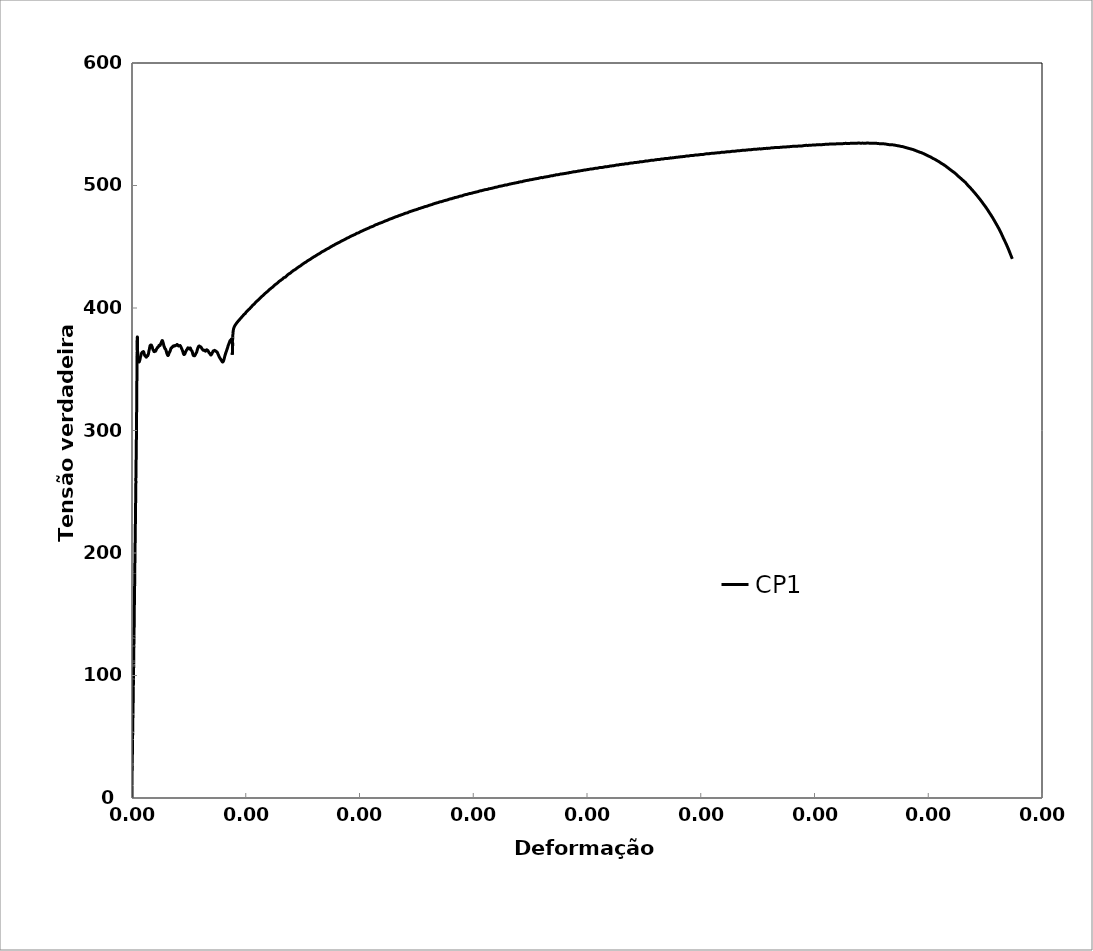
| Category | CP1 |
|---|---|
| 0.0 | 0 |
| 0.0 | 6.347 |
| 0.0 | 6.924 |
| 0.0 | 7.405 |
| 0.0 | 7.789 |
| -1.6833141676528276e-05 | 8.27 |
| -1.6833141676528276e-05 | 8.655 |
| -1.6833141676528276e-05 | 9.136 |
| -1.6833141676528276e-05 | 9.52 |
| -2.5249318761371077e-05 | 10.001 |
| -1.6833141676528276e-05 | 10.482 |
| -8.416035414737781e-06 | 10.963 |
| -8.416035414737781e-06 | 11.444 |
| -8.416035414737781e-06 | 11.924 |
| 0.0 | 12.405 |
| 0.0 | 12.886 |
| 0.0 | 13.463 |
| 0.0 | 14.04 |
| 0.0 | 14.521 |
| 8.416364582348424e-06 | 15.098 |
| 8.416364582348424e-06 | 15.675 |
| 8.416364582348424e-06 | 16.252 |
| 8.416364582348424e-06 | 16.829 |
| 8.416364582348424e-06 | 17.406 |
| 1.6832858326528217e-05 | 17.887 |
| 1.6832858326528217e-05 | 18.464 |
| 1.6832858326528217e-05 | 19.041 |
| 1.6832858326528217e-05 | 19.618 |
| 1.6832858326528217e-05 | 20.291 |
| 1.6832858326528217e-05 | 20.772 |
| 1.6832858326528217e-05 | 21.349 |
| 1.6832858326528217e-05 | 21.926 |
| 2.5248681249258854e-05 | 22.503 |
| 2.5248681249258854e-05 | 23.081 |
| 2.5248681249258854e-05 | 23.561 |
| 2.5248681249258854e-05 | 24.138 |
| 3.366543331292845e-05 | 24.812 |
| 3.366543331292845e-05 | 25.389 |
| 2.5248681249258854e-05 | 25.966 |
| 3.366543331292845e-05 | 26.447 |
| 4.208111457747699e-05 | 27.024 |
| 3.366543331292845e-05 | 27.601 |
| 4.208111457747699e-05 | 28.178 |
| 4.208111457747699e-05 | 28.755 |
| 4.208111457747699e-05 | 29.236 |
| 4.208111457747699e-05 | 29.717 |
| 4.208111457747699e-05 | 30.294 |
| 5.04967250189304e-05 | 30.87 |
| 5.04967250189304e-05 | 31.45 |
| 5.04967250189304e-05 | 31.929 |
| 5.04967250189304e-05 | 32.409 |
| 5.04967250189304e-05 | 32.988 |
| 5.04967250189304e-05 | 33.564 |
| 5.8913264579652434e-05 | 34.141 |
| 5.8913264579652434e-05 | 34.623 |
| 5.8913264579652434e-05 | 35.103 |
| 6.732873337007673e-05 | 35.583 |
| 6.732873337007673e-05 | 36.162 |
| 6.732873337007673e-05 | 36.642 |
| 6.732873337007673e-05 | 37.122 |
| 6.732873337007673e-05 | 37.604 |
| 6.732873337007673e-05 | 38.084 |
| 6.732873337007673e-05 | 38.567 |
| 7.574513126510098e-05 | 39.047 |
| 7.574513126510098e-05 | 39.526 |
| 7.574513126510098e-05 | 39.913 |
| 7.574513126510098e-05 | 40.392 |
| 7.574513126510098e-05 | 40.875 |
| 7.574513126510098e-05 | 41.355 |
| 8.416045840926459e-05 | 41.741 |
| 8.416045840926459e-05 | 42.124 |
| 8.416045840926459e-05 | 42.607 |
| 8.416045840926459e-05 | 42.99 |
| 8.416045840926459e-05 | 43.376 |
| 8.416045840926459e-05 | 43.759 |
| 9.25757147362932e-05 | 44.146 |
| 9.25757147362932e-05 | 44.819 |
| 9.25757147362932e-05 | 45.202 |
| 9.25757147362932e-05 | 45.875 |
| 0.00010099489984331438 | 46.551 |
| 0.00010099489984331438 | 46.934 |
| 9.25757147362932e-05 | 47.51 |
| 0.00010099489984331438 | 48.089 |
| 0.00010099489984331438 | 48.472 |
| 0.00010940401516256756 | 48.956 |
| 0.00010940401516256756 | 49.435 |
| 0.00010940401516256756 | 50.108 |
| 0.00010940401516256756 | 50.494 |
| 0.00010940401516256756 | 51.07 |
| 0.00011782305859080093 | 51.647 |
| 0.00011782305859080093 | 52.13 |
| 0.00011782305859080093 | 52.61 |
| 0.00011782305859080093 | 53.089 |
| 0.0001262420311395608 | 53.572 |
| 0.00011782305859080093 | 54.148 |
| 0.00011782305859080093 | 54.534 |
| 0.0001262420311395608 | 55.111 |
| 0.0001262420311395608 | 55.591 |
| 0.0001262420311395608 | 55.977 |
| 0.0001262420311395608 | 56.553 |
| 0.0001262420311395608 | 56.939 |
| 0.0001262420311395608 | 57.419 |
| 0.00013465093415590405 | 57.803 |
| 0.00013465093415590405 | 58.285 |
| 0.00013465093415590405 | 58.862 |
| 0.00013465093415590405 | 59.248 |
| 0.00013465093415590405 | 59.727 |
| 0.00013465093415590405 | 60.207 |
| 0.00014306976503302988 | 60.594 |
| 0.00014306976503302988 | 61.074 |
| 0.00014306976503302988 | 61.556 |
| 0.00014306976503302988 | 62.036 |
| 0.00014306976503302988 | 62.422 |
| 0.00014306976503302988 | 62.805 |
| 0.00015148852503403906 | 63.289 |
| 0.00015148852503403906 | 63.768 |
| 0.00015148852503403906 | 64.345 |
| 0.00015148852503403906 | 64.827 |
| 0.00015148852503403906 | 65.21 |
| 0.00015989721575885804 | 65.694 |
| 0.00015989721575885804 | 66.077 |
| 0.00015989721575885804 | 66.463 |
| 0.00015989721575885804 | 66.943 |
| 0.00015989721575885804 | 67.519 |
| 0.00016831583409538636 | 67.906 |
| 0.00015989721575885804 | 68.385 |
| 0.00016831583409538636 | 68.868 |
| 0.00016831583409538636 | 69.445 |
| 0.00016831583409538636 | 69.828 |
| 0.00016831583409538636 | 70.214 |
| 0.00016831583409538636 | 70.597 |
| 0.00017672438332613107 | 71.08 |
| 0.00017672438332613107 | 71.464 |
| 0.00017672438332613107 | 71.946 |
| 0.00018514286000294612 | 72.33 |
| 0.00018514286000294612 | 72.716 |
| 0.00018514286000294612 | 73.196 |
| 0.00018514286000294612 | 73.582 |
| 0.00018514286000294612 | 73.965 |
| 0.00018514286000294612 | 74.638 |
| 0.00019356126580938625 | 75.312 |
| 0.00019356126580938625 | 76.081 |
| 0.00019356126580938625 | 76.66 |
| 0.00019356126580938625 | 77.333 |
| 0.00020196960276669146 | 77.91 |
| 0.00020196960276669146 | 78.486 |
| 0.00020196960276669146 | 79.162 |
| 0.00020196960276669146 | 79.835 |
| 0.00020196960276669146 | 80.411 |
| 0.0002103878669205706 | 81.085 |
| 0.0002103878669205706 | 81.661 |
| 0.0002103878669205706 | 82.337 |
| 0.0002103878669205706 | 83.01 |
| 0.0002103878669205706 | 83.586 |
| 0.00021880606020809696 | 84.26 |
| 0.00021880606020809696 | 84.933 |
| 0.00021880606020809696 | 85.512 |
| 0.00021880606020809696 | 86.185 |
| 0.00021880606020809696 | 86.761 |
| 0.00021880606020809696 | 87.53 |
| 0.00022721418490201413 | 88.107 |
| 0.00022721418490201413 | 88.783 |
| 0.0002356322365439093 | 89.457 |
| 0.0002356322365439093 | 90.13 |
| 0.00024405021732280753 | 90.707 |
| 0.0002356322365439093 | 91.379 |
| 0.0002356322365439093 | 92.052 |
| 0.00024405021732280753 | 92.632 |
| 0.00024405021732280753 | 93.305 |
| 0.00024405021732280753 | 93.978 |
| 0.00025245812976449727 | 94.555 |
| 0.00025245812976449727 | 95.324 |
| 0.00025245812976449727 | 95.904 |
| 0.00026087596890513753 | 96.577 |
| 0.00025245812976449727 | 97.249 |
| 0.00026087596890513753 | 97.826 |
| 0.00026087596890513753 | 98.596 |
| 0.00026928373987916606 | 99.463 |
| 0.00026928373987916606 | 100.329 |
| 0.00026928373987916606 | 101.098 |
| 0.00026928373987916606 | 101.964 |
| 0.00026928373987916606 | 102.83 |
| 0.00026928373987916606 | 103.696 |
| 0.0002777014373863146 | 104.466 |
| 0.0002777014373863146 | 105.332 |
| 0.0002861190640364283 | 106.199 |
| 0.00029452662277564326 | 107.16 |
| 0.0002861190640364283 | 108.121 |
| 0.00029452662277564326 | 109.085 |
| 0.00029452662277564326 | 109.854 |
| 0.00030294410779963747 | 110.625 |
| 0.00029452662277564326 | 111.586 |
| 0.00030294410779963747 | 112.453 |
| 0.00030294410779963747 | 113.223 |
| 0.000311361521970174 | 114.186 |
| 0.000311361521970174 | 115.052 |
| 0.000311361521970174 | 115.915 |
| 0.000311361521970174 | 116.781 |
| 0.000311361521970174 | 117.647 |
| 0.0003197688684855118 | 118.515 |
| 0.0003197688684855118 | 119.284 |
| 0.0003197688684855118 | 120.053 |
| 0.0003197688684855118 | 120.92 |
| 0.00032818614103663474 | 121.787 |
| 0.00032818614103663474 | 122.653 |
| 0.00033660334273787686 | 123.423 |
| 0.00032818614103663474 | 124.385 |
| 0.00032818614103663474 | 125.347 |
| 0.00033660334273787686 | 126.308 |
| 0.00033660334273787686 | 127.271 |
| 0.00034501047704027315 | 128.234 |
| 0.00034501047704027315 | 129.197 |
| 0.00035342753712947286 | 130.254 |
| 0.00034501047704027315 | 131.312 |
| 0.00035342753712947286 | 132.469 |
| 0.00035342753712947286 | 133.432 |
| 0.0003618445263725903 | 134.393 |
| 0.0003618445263725903 | 135.548 |
| 0.0003618445263725903 | 136.701 |
| 0.00037025144847231407 | 137.665 |
| 0.00037025144847231407 | 138.627 |
| 0.0003786682961103158 | 139.688 |
| 0.0003786682961103158 | 140.648 |
| 0.0003786682961103158 | 141.707 |
| 0.0003786682961103158 | 142.669 |
| 0.0003786682961103158 | 143.729 |
| 0.0003870750767757022 | 144.786 |
| 0.00039549178281379684 | 145.847 |
| 0.00039549178281379684 | 146.809 |
| 0.00039549178281379684 | 147.865 |
| 0.00039549178281379684 | 149.118 |
| 0.00040390841801132523 | 150.368 |
| 0.00040390841801132523 | 151.524 |
| 0.00040390841801132523 | 152.87 |
| 0.00041231498649233443 | 154.124 |
| 0.00041231498649233443 | 155.47 |
| 0.00041231498649233443 | 156.816 |
| 0.0004207314800968815 | 158.07 |
| 0.0004207314800968815 | 159.222 |
| 0.00042914790286466015 | 160.476 |
| 0.00042914790286466015 | 161.822 |
| 0.00042914790286466015 | 163.168 |
| 0.000437554259171559 | 164.518 |
| 0.000437554259171559 | 165.864 |
| 0.00044597054035372554 | 167.212 |
| 0.00044597054035372554 | 168.368 |
| 0.00044597054035372554 | 169.521 |
| 0.00045438675070269926 | 170.774 |
| 0.00045438675070269926 | 171.927 |
| 0.0004627928948464195 | 173.278 |
| 0.0004627928948464195 | 174.624 |
| 0.000471208963616484 | 176.068 |
| 0.000471208963616484 | 177.414 |
| 0.0004796149663520414 | 178.861 |
| 0.0004796149663520414 | 180.207 |
| 0.0004796149663520414 | 181.746 |
| 0.0004880308935484037 | 183.094 |
| 0.0004796149663520414 | 184.535 |
| 0.0004964467499173096 | 186.077 |
| 0.0004964467499173096 | 187.426 |
| 0.0004964467499173096 | 188.772 |
| 0.0005048525405077569 | 190.12 |
| 0.0005048525405077569 | 191.566 |
| 0.0005132682553098844 | 193.01 |
| 0.0005132682553098844 | 194.549 |
| 0.0005216838992885744 | 195.994 |
| 0.0005216838992885744 | 197.436 |
| 0.0005300894777439535 | 199.17 |
| 0.0005300894777439535 | 200.71 |
| 0.0005300894777439535 | 202.249 |
| 0.0005385049801630104 | 203.983 |
| 0.0005469204117617603 | 205.717 |
| 0.0005469204117617603 | 207.546 |
| 0.0005553257780936661 | 209.278 |
| 0.0005553257780936661 | 210.817 |
| 0.0005637410681399277 | 212.648 |
| 0.0005637410681399277 | 214.187 |
| 0.0005721562873699007 | 215.921 |
| 0.0005721562873699007 | 217.654 |
| 0.000580561441588373 | 219.388 |
| 0.000580561441588373 | 220.928 |
| 0.00058897651927278 | 222.565 |
| 0.0005973815321163924 | 224.3 |
| 0.0006057964682604387 | 226.128 |
| 0.0006057964682604387 | 228.054 |
| 0.0006057964682604387 | 229.883 |
| 0.0006142113335939305 | 231.807 |
| 0.0006226161343421719 | 233.735 |
| 0.0006226161343421719 | 235.561 |
| 0.0006226161343421719 | 237.487 |
| 0.0006310308581420025 | 239.222 |
| 0.0006394455111348524 | 241.147 |
| 0.0006394455111348524 | 243.169 |
| 0.0006478500997986486 | 245 |
| 0.0006478500997986486 | 246.923 |
| 0.0006562646112652019 | 249.041 |
| 0.0006646790519285697 | 251.066 |
| 0.0006646790519285697 | 252.992 |
| 0.0006730834285181799 | 254.917 |
| 0.0006814977276621716 | 256.941 |
| 0.0006814977276621716 | 258.864 |
| 0.0006814977276621716 | 261.077 |
| 0.0006899019629030798 | 263.102 |
| 0.0006983161205328992 | 265.027 |
| 0.0006983161205328992 | 267.049 |
| 0.0007151342305500453 | 269.17 |
| 0.0007151342305500453 | 271.096 |
| 0.0007235481758749371 | 273.214 |
| 0.0007235481758749371 | 275.427 |
| 0.0007319620504059487 | 277.742 |
| 0.0007319620504059487 | 280.145 |
| 0.0007403658615455224 | 282.553 |
| 0.0007487795945764219 | 284.675 |
| 0.0007571932568172354 | 286.793 |
| 0.0007571932568172354 | 289.199 |
| 0.0007655968559218597 | 291.415 |
| 0.0007740103766694796 | 293.823 |
| 0.0007740103766694796 | 296.133 |
| 0.0007824238266305855 | 298.448 |
| 0.0007824238266305855 | 300.854 |
| 0.0007908272137111815 | 303.256 |
| 0.0007992405221862334 | 305.855 |
| 0.0007992405221862334 | 308.27 |
| 0.000807643767951631 | 310.567 |
| 0.000807643767951631 | 312.983 |
| 0.0008160569349456095 | 315.401 |
| 0.0008160569349456095 | 317.695 |
| 0.0008244700311590264 | 320.204 |
| 0.0008244700311590264 | 322.528 |
| 0.0008244700311590264 | 325.125 |
| 0.0008328730649177811 | 327.814 |
| 0.0008328730649177811 | 330.32 |
| 0.0008412860196572632 | 332.829 |
| 0.0008412860196572632 | 335.516 |
| 0.0008496989036195334 | 338.025 |
| 0.0008581017253830079 | 340.624 |
| 0.0008665144678784816 | 343.435 |
| 0.0008665144678784816 | 345.91 |
| 0.0008749271396000925 | 348.812 |
| 0.0008833297493787612 | 351.592 |
| 0.0008833297493787612 | 354.31 |
| 0.0009001447481303252 | 357.094 |
| 0.0009001447481303252 | 359.901 |
| 0.0009085571369373758 | 362.592 |
| 0.0009085571369373758 | 365.37 |
| 0.0009253717114993665 | 368.093 |
| 0.0009337838880909622 | 370.602 |
| 0.0009421959939184381 | 373.474 |
| 0.0009421959939184381 | 376.282 |
| 0.0009590100028716283 | 375.413 |
| 0.0009590100028716283 | 372.242 |
| 0.000967421896498148 | 369.075 |
| 0.000967421896498148 | 366.086 |
| 0.000975823729118675 | 363.099 |
| 0.000967421896498148 | 363.006 |
| 0.000967421896498148 | 362.13 |
| 0.0009590100028716283 | 363.003 |
| 0.0009505980384847809 | 364.721 |
| 0.0009337838880909622 | 367.613 |
| 0.0009253717114993665 | 370.478 |
| 0.000916969454976958 | 373.464 |
| 0.0009505980384847809 | 372.813 |
| 0.000967421896498148 | 369.528 |
| 0.00098423548131148 | 366.363 |
| 0.000992647162747527 | 363.287 |
| 0.000992647162747527 | 360.297 |
| 0.000992647162747527 | 357.338 |
| 0.000992647162747527 | 358.274 |
| 0.000975823729118675 | 361.167 |
| 0.000967421896498148 | 364.244 |
| 0.0009505980384847809 | 367.227 |
| 0.0009505980384847809 | 367.408 |
| 0.0009505980384847809 | 364.419 |
| 0.000916969454976958 | 363.078 |
| 0.0009505980384847809 | 360.101 |
| 0.00098423548131148 | 358.754 |
| 0.0010178817825252495 | 357.528 |
| 0.0010515469306837156 | 356.876 |
| 0.00108511105399554 | 356.495 |
| 0.0011187739389850136 | 356.205 |
| 0.0011523358059947271 | 356.127 |
| 0.0011859964281190313 | 356.048 |
| 0.0012196559172442127 | 355.879 |
| 0.001253214398694194 | 355.891 |
| 0.0012952607874523443 | 356.268 |
| 0.0013289165990575927 | 356.854 |
| 0.0013625712779873071 | 357.259 |
| 0.001396124963837958 | 357.845 |
| 0.0014297773810060198 | 358.733 |
| 0.0014634286657267883 | 359.409 |
| 0.001496978967667753 | 360.207 |
| 0.0015390151084705855 | 360.796 |
| 0.0015810494823105606 | 361.567 |
| 0.0016145958383358696 | 362.274 |
| 0.0016482409043574162 | 362.769 |
| 0.0016902706873066634 | 363.147 |
| 0.001723913207382303 | 363.371 |
| 0.0017574547712729208 | 363.564 |
| 0.0017910950312203858 | 363.788 |
| 0.0018331188105968931 | 363.894 |
| 0.0018666567118219902 | 364.088 |
| 0.0019002932984501413 | 364.1 |
| 0.0019339287536966096 | 364.203 |
| 0.0019674632741948895 | 364.336 |
| 0.0020010964702625133 | 364.439 |
| 0.002034728535176082 | 364.24 |
| 0.0020767420776141242 | 363.983 |
| 0.0021186540666344044 | 363.121 |
| 0.002152282178142119 | 362.559 |
| 0.0021859091588381984 | 361.906 |
| 0.0022194352305005788 | 361.525 |
| 0.0022614410136356424 | 361.057 |
| 0.002295064323911489 | 360.888 |
| 0.002337066930374099 | 360.782 |
| 0.002370587934778123 | 360.794 |
| 0.0024125873692386235 | 360.537 |
| 0.002454585039820489 | 360.159 |
| 0.0024882018566910716 | 359.899 |
| 0.002521717795368498 | 359.911 |
| 0.002555332355563211 | 360.105 |
| 0.0025889457858574686 | 360.389 |
| 0.0026224583482339727 | 360.613 |
| 0.0026644472058336907 | 361.112 |
| 0.0026980569686650396 | 361.124 |
| 0.002739942925775852 | 361.048 |
| 0.002773550151352373 | 361.06 |
| 0.002807156247521239 | 361.345 |
| 0.002840661498026556 | 361.841 |
| 0.002874265338958623 | 362.428 |
| 0.00290786805071073 | 363.015 |
| 0.0029498449262443742 | 364.089 |
| 0.0029833453963506867 | 364.888 |
| 0.003016944442978543 | 365.657 |
| 0.003050542360748172 | 366.365 |
| 0.003084039457669649 | 367.345 |
| 0.003117635121300201 | 367.933 |
| 0.0031512296562998337 | 368.611 |
| 0.0031847233807152605 | 369.289 |
| 0.003218315662029689 | 369.301 |
| 0.0032518071395979216 | 369.525 |
| 0.0032853971675292806 | 369.719 |
| 0.0033273581988936675 | 369.735 |
| 0.0033693174696040012 | 369.66 |
| 0.003411274979807584 | 369.675 |
| 0.0034447599956150205 | 369.203 |
| 0.0034783435429884078 | 369.034 |
| 0.003528666925539448 | 368.356 |
| 0.003562247655186007 | 368.005 |
| 0.0035957276161372293 | 367.412 |
| 0.003629306093950181 | 366.759 |
| 0.0036628834442870408 | 366.377 |
| 0.003713097911882654 | 365.73 |
| 0.003746672448877387 | 365.651 |
| 0.0037802458586602104 | 365.27 |
| 0.003813718521957488 | 365.1 |
| 0.003847289680888486 | 364.628 |
| 0.0038808597128346064 | 364.428 |
| 0.003922795765937906 | 364.353 |
| 0.003964630456165472 | 364.459 |
| 0.003998196549275225 | 364.683 |
| 0.004031761515739967 | 364.877 |
| 0.004073691241227351 | 364.983 |
| 0.004107154083731708 | 364.995 |
| 0.0041407153933010555 | 364.735 |
| 0.004182640550727107 | 365.023 |
| 0.004224464372068087 | 365.341 |
| 0.004258021744847729 | 366.02 |
| 0.00429157799156767 | 366.335 |
| 0.004325033543878226 | 366.529 |
| 0.004358587542046772 | 366.844 |
| 0.004400503566334865 | 367.132 |
| 0.0044340550323206706 | 367.448 |
| 0.004475868340088811 | 367.645 |
| 0.004509417277613668 | 367.96 |
| 0.004542965089644854 | 367.76 |
| 0.004576412232858863 | 367.894 |
| 0.004609957797468864 | 368.088 |
| 0.004651863286860126 | 368.498 |
| 0.004685406320560071 | 368.692 |
| 0.004718848699940562 | 369.007 |
| 0.004752389486859472 | 369.505 |
| 0.004794289008131161 | 369.611 |
| 0.004827727746474834 | 369.532 |
| 0.004869624111294537 | 369.245 |
| 0.004903159841553297 | 369.348 |
| 0.004936594939652679 | 369.451 |
| 0.004970128424108663 | 369.858 |
| 0.005012018823407563 | 370.176 |
| 0.005045549778775694 | 370.765 |
| 0.005078980116472059 | 371.171 |
| 0.005112508826676871 | 371.457 |
| 0.005146036412744966 | 371.863 |
| 0.005179463391364142 | 372.179 |
| 0.005221345022638845 | 372.771 |
| 0.00525486895995196 | 373.056 |
| 0.005288292300886656 | 373.372 |
| 0.00532181399397593 | 373.294 |
| 0.0053553345633989636 | 373.306 |
| 0.0053971093679661885 | 372.836 |
| 0.0054389818850550595 | 372.154 |
| 0.005489206700789202 | 371.415 |
| 0.005539428994117695 | 370.554 |
| 0.005589648765294109 | 369.511 |
| 0.005631513221218601 | 368.646 |
| 0.0056817283682752155 | 368.301 |
| 0.005723588969595598 | 367.618 |
| 0.005765447818679166 | 367.148 |
| 0.005807205494715339 | 366.8 |
| 0.00585741182035502 | 366.606 |
| 0.005899265068260308 | 366.439 |
| 0.005949466772255812 | 365.972 |
| 0.00599131616762032 | 365.107 |
| 0.00604151325082244 | 364.549 |
| 0.0060833587943551265 | 363.684 |
| 0.006125202586911569 | 363.031 |
| 0.006175392950024711 | 362.382 |
| 0.006217232891780804 | 361.911 |
| 0.006267418636187742 | 361.444 |
| 0.006317601862112129 | 361.158 |
| 0.006359336488324091 | 361.295 |
| 0.006401168734762003 | 361.583 |
| 0.006451345249292421 | 362.178 |
| 0.006509864775829272 | 363.08 |
| 0.006560035836804196 | 363.857 |
| 0.0066102043807702605 | 363.997 |
| 0.006668714611956479 | 364.383 |
| 0.006718877704099417 | 365.191 |
| 0.0067690382800327615 | 365.786 |
| 0.006827638538387531 | 366.779 |
| 0.006886136049205769 | 367.378 |
| 0.006944630138265619 | 367.308 |
| 0.006994779391889073 | 367.509 |
| 0.007044926130690783 | 368.013 |
| 0.007095070354923178 | 368.214 |
| 0.007153552224195331 | 368.357 |
| 0.007203691001888909 | 368.862 |
| 0.007262166519352845 | 368.671 |
| 0.007312299851690877 | 368.689 |
| 0.0073624306708036736 | 368.799 |
| 0.007412558976943422 | 369.212 |
| 0.007462684770362051 | 369.049 |
| 0.007512808051311674 | 369.249 |
| 0.007579602103092957 | 369.365 |
| 0.007638055643734313 | 369.204 |
| 0.007696605001057752 | 369.317 |
| 0.007755051703065396 | 369.552 |
| 0.007813494989255706 | 369.664 |
| 0.007871934860027924 | 370.051 |
| 0.007930371315781217 | 370.194 |
| 0.00799713748357332 | 370.006 |
| 0.008055665821275156 | 369.754 |
| 0.008114091541742136 | 369.289 |
| 0.008172513848843729 | 369.006 |
| 0.00823093274297897 | 369.119 |
| 0.008289348224546154 | 369.141 |
| 0.008347760293943955 | 369.162 |
| 0.008406268114473182 | 369.184 |
| 0.008473002517078805 | 369.33 |
| 0.008531403860148013 | 368.743 |
| 0.008598129912695464 | 368.312 |
| 0.00866495065042749 | 367.545 |
| 0.00873999473142527 | 366.69 |
| 0.008815132303597 | 365.957 |
| 0.008890165115619663 | 365.01 |
| 0.00896519229814184 | 363.972 |
| 0.00904031295205595 | 362.843 |
| 0.009115328870677166 | 362.079 |
| 0.009190438247503888 | 362.106 |
| 0.009265442905605756 | 362.438 |
| 0.009332219069353663 | 362.949 |
| 0.00939889170983435 | 363.826 |
| 0.009473880735171167 | 364.645 |
| 0.009540642982155708 | 365.248 |
| 0.009607301728374928 | 365.942 |
| 0.009673956031501871 | 366.18 |
| 0.009749023463482106 | 366.786 |
| 0.009823986238359892 | 367.484 |
| 0.0099073596328887 | 367.24 |
| 0.00998201351958398 | 367.146 |
| 0.010057255829558357 | 367.173 |
| 0.010132492478553468 | 366.439 |
| 0.010207723467421072 | 367.351 |
| 0.010281959026783034 | 367.165 |
| 0.010357178772397573 | 365.943 |
| 0.010432392860427542 | 365.391 |
| 0.010515517639675405 | 365.116 |
| 0.010590719819782431 | 364.382 |
| 0.01066492695369439 | 362.854 |
| 0.010749021715679211 | 361.695 |
| 0.010832120180482867 | 361.146 |
| 0.010915211740505443 | 361.084 |
| 0.01099829639689452 | 360.931 |
| 0.011081374150796519 | 361.449 |
| 0.011164445003358886 | 362.15 |
| 0.011248497770746962 | 363.066 |
| 0.01133155474194425 | 363.553 |
| 0.011414604815253988 | 364.682 |
| 0.01149764799182204 | 366.146 |
| 0.011580684272793325 | 367.367 |
| 0.01166371365931292 | 368.252 |
| 0.011747724474025195 | 368.771 |
| 0.011830739993033489 | 369.016 |
| 0.011921653845303765 | 368.439 |
| 0.012013547491812191 | 368.473 |
| 0.012105432694654044 | 368.14 |
| 0.012196321578117243 | 367.685 |
| 0.012288189989031117 | 366.833 |
| 0.012379062264160058 | 366.286 |
| 0.01247091388928247 | 365.831 |
| 0.012561769562145803 | 365.467 |
| 0.012653604407609464 | 365.409 |
| 0.012745430820208709 | 365.534 |
| 0.01283626155620721 | 364.987 |
| 0.012928071198357358 | 364.745 |
| 0.013027768897249149 | 365.271 |
| 0.013127456657500846 | 365.888 |
| 0.013235029329606044 | 365.622 |
| 0.013343577176616796 | 365.172 |
| 0.013451126603822562 | 364.447 |
| 0.013550772171527017 | 363.413 |
| 0.0136582993185358 | 363.055 |
| 0.013766801232714704 | 362.207 |
| 0.013866415351372305 | 361.57 |
| 0.01396601954804585 | 362.096 |
| 0.014073502056357108 | 362.9 |
| 0.014181958932037586 | 364.01 |
| 0.01428941823439506 | 364.936 |
| 0.014396865990491616 | 364.884 |
| 0.014505287802700691 | 365.413 |
| 0.0146127123678453 | 365.146 |
| 0.014721110781393116 | 364.91 |
| 0.01482851216559466 | 364.368 |
| 0.014936887190577782 | 364.193 |
| 0.015044265403838446 | 363.252 |
| 0.015160496712152735 | 361.947 |
| 0.015276714512319827 | 360.794 |
| 0.015400796576022903 | 359.583 |
| 0.015516986454045993 | 358.736 |
| 0.01564103870974098 | 357.8 |
| 0.015757200679033394 | 356.984 |
| 0.015881223141038302 | 356.047 |
| 0.015997357215004573 | 356.089 |
| 0.016121349897627098 | 357.206 |
| 0.01624532720797009 | 359.304 |
| 0.016370272913320775 | 361.588 |
| 0.016494219368610907 | 363.411 |
| 0.01661815046308116 | 365.02 |
| 0.016742066200538207 | 366.722 |
| 0.016866949859772048 | 368.609 |
| 0.01699083477281292 | 370.311 |
| 0.017114704340283178 | 371.738 |
| 0.01724740470943386 | 373.352 |
| 0.017379104700975343 | 373.801 |
| 0.017511769991065684 | 374.618 |
| 0.01760315139796089 | 371.735 |
| 0.017693541993470466 | 371.677 |
| 0.017693541993470466 | 369.128 |
| 0.01767683999880965 | 365.99 |
| 0.017652277735189556 | 362.942 |
| 0.017652277735189556 | 365.091 |
| 0.017661120219593828 | 368.042 |
| 0.017661120219593828 | 365.862 |
| 0.017652277735189556 | 363.709 |
| 0.017644417683411417 | 361.864 |
| 0.017652277735189556 | 364.907 |
| 0.017652277735189556 | 364.907 |
| 0.017652277735189556 | 364.999 |
| 0.017661120219593828 | 367.919 |
| 0.01766898014009078 | 370.194 |
| 0.017685682266026116 | 371.367 |
| 0.01767683999880965 | 369.982 |
| 0.017685682266026116 | 372.933 |
| 0.0177023841130051 | 375.887 |
| 0.017743646303777946 | 378.819 |
| 0.017809465798258692 | 381.792 |
| 0.017925376166276246 | 383.986 |
| 0.018057969009698124 | 385.296 |
| 0.018189562300201557 | 386.33 |
| 0.018329974848208117 | 387.275 |
| 0.018470367683298947 | 388.129 |
| 0.018610740811008372 | 388.952 |
| 0.018751094236868177 | 389.682 |
| 0.018892409251823804 | 390.444 |
| 0.019040572300132556 | 391.363 |
| 0.0191808654148649 | 391.91 |
| 0.01932113885020006 | 392.857 |
| 0.0194702191135243 | 393.5 |
| 0.01961829658282733 | 394.358 |
| 0.0197673325556805 | 395.001 |
| 0.019915366038967926 | 395.552 |
| 0.020064357747659075 | 396.596 |
| 0.020212347271054993 | 397.24 |
| 0.020361294741869075 | 397.976 |
| 0.020518057589395258 | 398.716 |
| 0.020682632135178458 | 399.367 |
| 0.020839344620978948 | 400.23 |
| 0.02099603255182403 | 400.971 |
| 0.02115269593540765 | 401.834 |
| 0.0213171660775949 | 402.578 |
| 0.021481609173802457 | 403.23 |
| 0.021647003819013935 | 404.098 |
| 0.021811392689083615 | 404.843 |
| 0.021975754539894077 | 405.711 |
| 0.02214106748305133 | 406.272 |
| 0.02230537516128399 | 407.11 |
| 0.022469655846938552 | 407.763 |
| 0.022642708093016706 | 408.636 |
| 0.022806933375281377 | 409.289 |
| 0.022979927269614866 | 410.039 |
| 0.023144097185846237 | 410.693 |
| 0.023317032767773214 | 411.567 |
| 0.023489938448155664 | 412.225 |
| 0.023654024664109617 | 412.879 |
| 0.02383468369899318 | 413.541 |
| 0.024007499905482566 | 414.292 |
| 0.024180286251691205 | 415.075 |
| 0.024353042747935785 | 415.734 |
| 0.024524793631509 | 416.392 |
| 0.024697490627254293 | 416.959 |
| 0.024870157803897057 | 417.711 |
| 0.025042795171732645 | 418.588 |
| 0.025214427640726383 | 419.155 |
| 0.02539577994439769 | 419.726 |
| 0.025559553761424755 | 420.382 |
| 0.025739868904047825 | 421.139 |
| 0.025920151538981993 | 421.896 |
| 0.02609260774941635 | 422.371 |
| 0.02626503422383406 | 423.033 |
| 0.026436457063035487 | 423.601 |
| 0.026608824264029104 | 424.386 |
| 0.026781161759690676 | 424.924 |
| 0.026944708863081295 | 425.118 |
| 0.0271169884879377 | 425.966 |
| 0.027289238437637312 | 426.721 |
| 0.02746048580974937 | 427.414 |
| 0.02763267660730643 | 427.984 |
| 0.027812618355298552 | 428.433 |
| 0.027984748534763126 | 429.097 |
| 0.028156849090528294 | 429.791 |
| 0.028328920032788595 | 430.455 |
| 0.028499989469901302 | 430.901 |
| 0.02867977523378253 | 431.382 |
| 0.028860500233011527 | 431.956 |
| 0.02903147876493615 | 432.62 |
| 0.029203399287570705 | 433.192 |
| 0.02937529025861939 | 433.763 |
| 0.029562685729149208 | 434.248 |
| 0.029734514958500543 | 434.82 |
| 0.029906314667639967 | 435.486 |
| 0.030078084866709296 | 436.058 |
| 0.03025758716069703 | 436.634 |
| 0.030437057239393633 | 437.116 |
| 0.030608736304717356 | 437.564 |
| 0.030780385901398467 | 438.231 |
| 0.030959762186298565 | 438.807 |
| 0.031130382196561862 | 439.193 |
| 0.031310664891946914 | 439.677 |
| 0.03148122504679481 | 440.25 |
| 0.031652724959285214 | 440.824 |
| 0.03182419546459867 | 441.273 |
| 0.03200338462926733 | 441.85 |
| 0.03218254169093167 | 442.241 |
| 0.0323539213801468 | 442.815 |
| 0.032533015657304744 | 443.3 |
| 0.032704335298068765 | 443.843 |
| 0.032875625593440844 | 444.231 |
| 0.03305462646908782 | 444.716 |
| 0.03322488945809825 | 445.291 |
| 0.033396090618428534 | 445.866 |
| 0.03356726247393847 | 446.223 |
| 0.03374613959985024 | 446.615 |
| 0.033917251552437695 | 447.097 |
| 0.034096066089859295 | 447.645 |
| 0.034274848658358746 | 448.131 |
| 0.034445870174151696 | 448.52 |
| 0.03462459022030255 | 448.881 |
| 0.03480327833130587 | 449.461 |
| 0.03497420950585009 | 450.038 |
| 0.035152835160541386 | 450.431 |
| 0.03532370660047187 | 450.914 |
| 0.035502269842496645 | 451.276 |
| 0.035680801205382154 | 451.856 |
| 0.035851582462506165 | 452.246 |
| 0.03603005147858808 | 452.702 |
| 0.03620077310581595 | 453.092 |
| 0.03637917981862462 | 453.455 |
| 0.03655755470815572 | 453.849 |
| 0.036735897785759974 | 454.43 |
| 0.03690649896255066 | 454.821 |
| 0.037084779824764984 | 455.184 |
| 0.03726302890857908 | 455.578 |
| 0.03744220947586635 | 456.035 |
| 0.037611727121518265 | 456.426 |
| 0.03778217895893458 | 457.005 |
| 0.03796030378639567 | 457.274 |
| 0.03813069622369423 | 457.666 |
| 0.03831742069207205 | 458.159 |
| 0.03849545021368604 | 458.616 |
| 0.038664789425547436 | 459.008 |
| 0.03884371902300035 | 459.278 |
| 0.03901299927455488 | 459.669 |
| 0.039199559083381755 | 460.037 |
| 0.039369740509691574 | 460.524 |
| 0.03954758280249948 | 461.013 |
| 0.039725393473049764 | 461.19 |
| 0.039903172532586385 | 461.585 |
| 0.04008091999234648 | 462.044 |
| 0.040258635863562035 | 462.535 |
| 0.04043728052731598 | 462.837 |
| 0.040614933084515484 | 463.202 |
| 0.04079255408688983 | 463.599 |
| 0.04097014354564642 | 463.964 |
| 0.04114002394353659 | 464.357 |
| 0.041325227877106484 | 464.632 |
| 0.041503682118458986 | 465.029 |
| 0.04168114534446742 | 465.395 |
| 0.04185857708286708 | 465.886 |
| 0.04203597734483 | 466.158 |
| 0.042205676790262624 | 466.457 |
| 0.04239068348410232 | 466.732 |
| 0.04256894770857395 | 467.225 |
| 0.04274622200651703 | 467.717 |
| 0.04292346488385317 | 468.083 |
| 0.04310067635171898 | 468.26 |
| 0.04327785642124429 | 468.658 |
| 0.04345500510355389 | 469.056 |
| 0.04363307971537186 | 469.329 |
| 0.04381016548708852 | 469.601 |
| 0.043987219904987086 | 469.905 |
| 0.04416424298016782 | 470.272 |
| 0.04434123472372596 | 470.671 |
| 0.04451819514675021 | 471.038 |
| 0.044695124260323384 | 471.342 |
| 0.04487297819490212 | 471.615 |
| 0.04504984455370886 | 471.919 |
| 0.04522667963633813 | 472.382 |
| 0.04540348345384964 | 472.686 |
| 0.045580256017297226 | 472.959 |
| 0.04576559476738355 | 473.236 |
| 0.04594230333672853 | 473.636 |
| 0.046118980685671655 | 473.909 |
| 0.04629562682524326 | 474.309 |
| 0.04648083304908367 | 474.586 |
| 0.04665741528603755 | 474.796 |
| 0.04683396634721003 | 475.165 |
| 0.047019072903277725 | 475.569 |
| 0.047195560130592125 | 475.748 |
| 0.04737201621566125 | 476.116 |
| 0.04754844116947342 | 476.327 |
| 0.04773341553102886 | 476.7 |
| 0.04791740247133494 | 477.104 |
| 0.04809468428411502 | 477.378 |
| 0.04827098179853856 | 477.557 |
| 0.04845486986934189 | 477.74 |
| 0.048632056432967245 | 478.237 |
| 0.04880825924381043 | 478.543 |
| 0.04898443101269245 | 478.817 |
| 0.049168187947534615 | 479.095 |
| 0.04934524817703319 | 479.402 |
| 0.04952893882726722 | 479.68 |
| 0.04970498368966237 | 479.955 |
| 0.049880997565718635 | 480.166 |
| 0.050065541006721906 | 480.445 |
| 0.05025005039772717 | 480.724 |
| 0.05043357493466463 | 481.129 |
| 0.05061801643870882 | 481.313 |
| 0.05079386969579806 | 481.62 |
| 0.05096969203395639 | 481.895 |
| 0.05114548346405416 | 482.075 |
| 0.05132979372144174 | 482.482 |
| 0.05150552186570616 | 482.757 |
| 0.051697362740936774 | 482.945 |
| 0.05187302631052099 | 483.125 |
| 0.05204865902783484 | 483.432 |
| 0.05223280291117136 | 483.808 |
| 0.05240837245685462 | 484.02 |
| 0.05259245011917063 | 484.299 |
| 0.052767956538649706 | 484.48 |
| 0.0529510196015405 | 484.887 |
| 0.05313499741092169 | 485.167 |
| 0.05331894137869455 | 485.447 |
| 0.053494320351773934 | 485.659 |
| 0.05367725050471785 | 485.939 |
| 0.053861094764509156 | 486.124 |
| 0.054036378689385094 | 486.528 |
| 0.054220156943440574 | 486.713 |
| 0.05440295437929199 | 486.802 |
| 0.05458666528324021 | 487.082 |
| 0.054761822084529635 | 487.391 |
| 0.05493694821128679 | 487.667 |
| 0.05512056104993639 | 487.852 |
| 0.055311709731072085 | 488.041 |
| 0.05548673959303256 | 488.254 |
| 0.055669305668506086 | 488.63 |
| 0.05584521864310905 | 488.94 |
| 0.05602771929016894 | 489.125 |
| 0.056211131976790285 | 489.214 |
| 0.056386004497531866 | 489.587 |
| 0.05657691146687763 | 489.776 |
| 0.056751720040124055 | 490.181 |
| 0.056934999996045316 | 490.271 |
| 0.057117301883752664 | 490.456 |
| 0.05730051485423242 | 490.642 |
| 0.05747519699220043 | 491.047 |
| 0.057657400436538296 | 491.233 |
| 0.05784051448973229 | 491.418 |
| 0.058023595018308345 | 491.508 |
| 0.05820569857912479 | 491.918 |
| 0.058380222682997245 | 492.195 |
| 0.05857074935777962 | 492.513 |
| 0.0587536962555954 | 492.603 |
| 0.058928124755203086 | 492.785 |
| 0.05911100628995671 | 493.067 |
| 0.05929291195493483 | 493.381 |
| 0.059475726795108805 | 493.471 |
| 0.059657566133488646 | 493.657 |
| 0.059840314327710364 | 493.843 |
| 0.06002302913113139 | 494.126 |
| 0.06020476898468611 | 494.344 |
| 0.060387417215059525 | 494.53 |
| 0.060569090862855245 | 494.716 |
| 0.06075167256867561 | 494.903 |
| 0.06093328005893099 | 495.185 |
| 0.06111579528864011 | 495.5 |
| 0.06129827721261887 | 495.686 |
| 0.06147978547150794 | 495.776 |
| 0.061662200992001245 | 496.059 |
| 0.06185210344663815 | 496.282 |
| 0.062033511218437885 | 496.564 |
| 0.062215825767925836 | 496.655 |
| 0.06239716757564903 | 496.745 |
| 0.06257941584338561 | 496.932 |
| 0.06276163090274339 | 497.344 |
| 0.06294287376914949 | 497.434 |
| 0.06313253319959428 | 497.625 |
| 0.06330619964124386 | 497.711 |
| 0.06348828232981302 | 497.995 |
| 0.0636703318703123 | 498.214 |
| 0.06385985339470773 | 498.501 |
| 0.06404089734338604 | 498.591 |
| 0.06422284631751761 | 498.779 |
| 0.0644038245663952 | 499.062 |
| 0.06459320714226428 | 499.382 |
| 0.06477505566107496 | 499.473 |
| 0.06495593400869626 | 499.563 |
| 0.06513771658411872 | 499.847 |
| 0.06532696023776058 | 499.942 |
| 0.06550024603189708 | 500.254 |
| 0.06568942109806382 | 500.445 |
| 0.06587107039930695 | 500.439 |
| 0.06606017533438592 | 500.727 |
| 0.06624082140196436 | 500.914 |
| 0.0664298564348364 | 501.235 |
| 0.06661137129850159 | 501.326 |
| 0.06680033630405445 | 501.517 |
| 0.06698084872599726 | 501.704 |
| 0.06716226361298896 | 501.796 |
| 0.06735112455766809 | 502.084 |
| 0.06753247228963587 | 502.175 |
| 0.06771285261222054 | 502.362 |
| 0.06789413476343352 | 502.453 |
| 0.06808285754984096 | 502.871 |
| 0.06826313863001686 | 502.962 |
| 0.06845179179640046 | 503.057 |
| 0.06864040937947989 | 503.152 |
| 0.06881312199964679 | 503.562 |
| 0.06900167144823158 | 503.657 |
| 0.06919018535262353 | 503.946 |
| 0.06937119991172688 | 504.037 |
| 0.06955964417429673 | 504.229 |
| 0.069748052932317 | 504.324 |
| 0.0699289665465599 | 504.642 |
| 0.0701089151451479 | 504.732 |
| 0.0702972204538632 | 504.827 |
| 0.07048549031036494 | 505.02 |
| 0.07066627057338007 | 505.208 |
| 0.07085447096822475 | 505.4 |
| 0.07104263595034538 | 505.495 |
| 0.07122238427523492 | 505.683 |
| 0.07141048004819736 | 505.779 |
| 0.07159854044779347 | 506.1 |
| 0.0717865654873252 | 506.293 |
| 0.07197455518008763 | 506.485 |
| 0.07215506647416475 | 506.382 |
| 0.07233461497064904 | 506.57 |
| 0.07252250167365995 | 506.86 |
| 0.07270291409321948 | 506.952 |
| 0.07289073161696058 | 507.144 |
| 0.07307851387190345 | 507.239 |
| 0.07325882601687966 | 507.331 |
| 0.07345397262835993 | 507.657 |
| 0.07363421709236981 | 507.846 |
| 0.07382093096134018 | 507.941 |
| 0.07400853863894521 | 508.036 |
| 0.0741886831822135 | 508.323 |
| 0.07437622188583093 | 508.418 |
| 0.07456372542527755 | 508.741 |
| 0.07475119381373749 | 508.739 |
| 0.07493120463343077 | 508.83 |
| 0.07511025541428726 | 509.019 |
| 0.07530596855510165 | 509.314 |
| 0.0754849522527612 | 509.307 |
| 0.07566483104831793 | 509.497 |
| 0.07585950874609962 | 509.596 |
| 0.07603932018555759 | 509.785 |
| 0.07622651217651112 | 509.881 |
| 0.07641366913318119 | 510.074 |
| 0.07659245469797357 | 510.165 |
| 0.07678787799610913 | 510.265 |
| 0.07697492992856744 | 510.588 |
| 0.07678787799610913 | 510.493 |
| 0.07697492992856744 | 510.686 |
| 0.07716194687914385 | 510.684 |
| 0.07735633336822886 | 510.881 |
| 0.07755160745824508 | 511.078 |
| 0.07774591822469075 | 511.275 |
| 0.0779559164538915 | 511.285 |
| 0.07815107350738039 | 511.483 |
| 0.0783526649709421 | 511.586 |
| 0.07854774461906752 | 511.914 |
| 0.07874186194048835 | 511.915 |
| 0.07892854876740998 | 512.109 |
| 0.07913090749468198 | 512.212 |
| 0.07931752171282498 | 512.406 |
| 0.0795114896791618 | 512.603 |
| 0.07969803289539364 | 512.699 |
| 0.07988454131974425 | 512.795 |
| 0.0800793223878249 | 512.993 |
| 0.080273142659817 | 513.092 |
| 0.08046784805778585 | 513.323 |
| 0.08066159304754664 | 513.422 |
| 0.08084054316429566 | 513.514 |
| 0.08103421596669172 | 513.614 |
| 0.08122785126719617 | 513.811 |
| 0.08141407461221345 | 514.005 |
| 0.08160026328455326 | 514.101 |
| 0.08178641729712452 | 514.098 |
| 0.08198082830379534 | 514.296 |
| 0.08216691149272959 | 514.589 |
| 0.08236032760876333 | 514.688 |
| 0.08254634019922115 | 514.784 |
| 0.08273231819543002 | 514.781 |
| 0.08291826161025509 | 514.975 |
| 0.08311245271976535 | 515.174 |
| 0.0833056860569819 | 515.405 |
| 0.08349152289829045 | 515.369 |
| 0.08367732521068408 | 515.465 |
| 0.08385573652280237 | 515.557 |
| 0.08404882630003424 | 515.886 |
| 0.08423452510262658 | 515.883 |
| 0.08442754176056338 | 516.082 |
| 0.08461317025598937 | 516.079 |
| 0.08479876429987213 | 516.273 |
| 0.08499259061097691 | 516.472 |
| 0.08516984908414336 | 516.662 |
| 0.08535533985008156 | 516.659 |
| 0.08554079621557659 | 516.755 |
| 0.08571887540253764 | 517.044 |
| 0.08589692288294785 | 517.136 |
| 0.0860740211422044 | 517.228 |
| 0.08624374910538535 | 517.316 |
| 0.08639877271927798 | 517.297 |
| 0.0865455184944094 | 517.472 |
| 0.08671516645695461 | 517.691 |
| 0.08689211987878315 | 517.783 |
| 0.08706995860702661 | 517.743 |
| 0.08725509728742503 | 517.839 |
| 0.08744020169783707 | 518.165 |
| 0.08762527185094743 | 518.261 |
| 0.08781030775943378 | 518.357 |
| 0.08800263553050801 | 518.358 |
| 0.08818760163279238 | 518.553 |
| 0.08837253352894463 | 518.748 |
| 0.08856566845259532 | 518.848 |
| 0.08875053045180947 | 518.845 |
| 0.08894267749429698 | 519.043 |
| 0.08913478762339125 | 519.044 |
| 0.08932777539944936 | 519.441 |
| 0.08951981156868023 | 519.343 |
| 0.08971272506129155 | 519.443 |
| 0.08990468732758405 | 519.543 |
| 0.09009752659391204 | 519.742 |
| 0.09028941501412613 | 519.941 |
| 0.09048126662023828 | 520.041 |
| 0.0906739947421969 | 520.042 |
| 0.0908657725873298 | 520.241 |
| 0.09105842662555688 | 520.341 |
| 0.09125743305466907 | 520.577 |
| 0.09144179816382071 | 520.541 |
| 0.09164164075422673 | 520.645 |
| 0.09183414539067059 | 520.745 |
| 0.0920184042146353 | 520.973 |
| 0.09220262909354057 | 521.069 |
| 0.09238682003989097 | 521.165 |
| 0.0925627727719654 | 521.124 |
| 0.09274689740116002 | 521.22 |
| 0.09292369805705888 | 521.445 |
| 0.0931077562491248 | 521.64 |
| 0.09327629467970204 | 521.728 |
| 0.09346028799088019 | 521.725 |
| 0.09362876702178671 | 521.912 |
| 0.09381997909750293 | 522.012 |
| 0.09398930783690915 | 522.1 |
| 0.09416497885742235 | 522.093 |
| 0.09434152899538986 | 522.185 |
| 0.09451713815718012 | 522.276 |
| 0.0946936261378059 | 522.568 |
| 0.09487735887813267 | 522.465 |
| 0.09505378330118683 | 522.656 |
| 0.09522926744009878 | 522.649 |
| 0.09540108476325304 | 522.838 |
| 0.09558286989373 | 522.933 |
| 0.09576462198437934 | 523.128 |
| 0.09593725587829288 | 523.118 |
| 0.0961280270942204 | 523.218 |
| 0.09630059826890462 | 523.308 |
| 0.09648221996956478 | 523.503 |
| 0.09665473003686288 | 523.494 |
| 0.0968544413638823 | 523.598 |
| 0.09702688723672685 | 523.689 |
| 0.0971993033771195 | 523.779 |
| 0.09738076194155432 | 523.974 |
| 0.09756218758475248 | 524.069 |
| 0.09774358031865692 | 524.064 |
| 0.0979249401552045 | 524.159 |
| 0.09810626710632599 | 524.354 |
| 0.09828756118394523 | 524.449 |
| 0.0984688223999792 | 524.544 |
| 0.09864099012801714 | 524.535 |
| 0.09882218729821289 | 524.63 |
| 0.09901240899764745 | 524.829 |
| 0.0991935388863855 | 524.924 |
| 0.09937463597302851 | 524.82 |
| 0.09954664783321762 | 525.01 |
| 0.09973673178753624 | 525.01 |
| 0.09992677961681165 | 525.309 |
| 0.10010774397637497 | 525.304 |
| 0.10028867559376412 | 525.4 |
| 0.10047861856621895 | 525.399 |
| 0.1006685254671926 | 525.599 |
| 0.1008493556590943 | 525.794 |
| 0.10103919217426584 | 525.894 |
| 0.10122899265837498 | 525.894 |
| 0.10142779263011327 | 525.898 |
| 0.10161751937899183 | 526.098 |
| 0.10180721013845918 | 526.198 |
| 0.10199686492216649 | 526.298 |
| 0.10219551231466986 | 526.302 |
| 0.1023850934762867 | 526.402 |
| 0.10257463870369925 | 526.502 |
| 0.10276414801052704 | 526.601 |
| 0.102962643057825 | 526.706 |
| 0.10315207885544266 | 526.672 |
| 0.1033324605435828 | 526.767 |
| 0.1035308428268922 | 527.005 |
| 0.10372918576247704 | 527.11 |
| 0.10390946339051149 | 527.071 |
| 0.10409871992831266 | 527.171 |
| 0.10428794065485412 | 527.271 |
| 0.10447712558368581 | 527.37 |
| 0.10466627472834991 | 527.604 |
| 0.10485538810238096 | 527.469 |
| 0.10505346852367929 | 527.574 |
| 0.10524250869527865 | 527.674 |
| 0.1054315131374455 | 527.874 |
| 0.10562947948381338 | 527.978 |
| 0.1058274066472635 | 527.982 |
| 0.10601630058388012 | 527.981 |
| 0.10620515884631596 | 528.182 |
| 0.10639398144804323 | 528.282 |
| 0.10660074625381408 | 528.391 |
| 0.10678949418151777 | 528.39 |
| 0.10697820649016418 | 528.49 |
| 0.1071758669102071 | 528.594 |
| 0.1073645063265233 | 528.795 |
| 0.10757107057996666 | 528.702 |
| 0.10776861386054594 | 528.706 |
| 0.10796611812548448 | 528.911 |
| 0.10815460854220249 | 529.011 |
| 0.10836100967006483 | 529.12 |
| 0.10855839698049623 | 529.124 |
| 0.10874677580189163 | 529.089 |
| 0.10895305475454659 | 529.332 |
| 0.10915032524890046 | 529.437 |
| 0.10934755683528188 | 529.541 |
| 0.1095537119094435 | 529.516 |
| 0.10974190334549634 | 529.515 |
| 0.10994797714752563 | 529.725 |
| 0.11014505148998005 | 529.829 |
| 0.11035104223903695 | 529.938 |
| 0.11054803717153158 | 529.84 |
| 0.11074499330466614 | 529.945 |
| 0.11095086052103907 | 530.054 |
| 0.11115668536482422 | 530.264 |
| 0.11136246785346064 | 530.171 |
| 0.11155926366055614 | 530.377 |
| 0.11176496333082041 | 530.283 |
| 0.11197062069743204 | 530.494 |
| 0.11216729687074778 | 530.497 |
| 0.11237287151964859 | 530.707 |
| 0.11257840391629896 | 530.715 |
| 0.1127928274751221 | 530.829 |
| 0.11298934202229731 | 530.933 |
| 0.11320367749385214 | 531.047 |
| 0.1134090392213981 | 531.021 |
| 0.11361435878416379 | 531.028 |
| 0.11382856034865423 | 531.041 |
| 0.1140337938024276 | 531.251 |
| 0.11423898514407292 | 531.259 |
| 0.11445305296871258 | 531.372 |
| 0.11465815830885863 | 531.38 |
| 0.11487213643041223 | 531.494 |
| 0.11508606877512442 | 531.506 |
| 0.11529104433473464 | 531.716 |
| 0.11550488708984423 | 531.728 |
| 0.1157186841260062 | 531.741 |
| 0.11593243546276592 | 531.854 |
| 0.11614614111965563 | 531.968 |
| 0.11635089952770666 | 532.077 |
| 0.11658231507986459 | 532.064 |
| 0.1167869842062414 | 532.072 |
| 0.11700940314657593 | 532.088 |
| 0.11722287879782008 | 532.304 |
| 0.11744520081884267 | 532.32 |
| 0.11766747342377033 | 532.337 |
| 0.11788969663456565 | 532.353 |
| 0.11810298446730362 | 532.569 |
| 0.11832511092925362 | 532.687 |
| 0.11855607012156771 | 532.81 |
| 0.11876921588743496 | 532.686 |
| 0.11900007254423514 | 532.809 |
| 0.1192219998506377 | 532.825 |
| 0.1194438779162388 | 532.943 |
| 0.11967457889330453 | 532.964 |
| 0.11989635657539491 | 532.98 |
| 0.1201180850830506 | 532.997 |
| 0.12035749666373399 | 533.226 |
| 0.12058798698859345 | 533.247 |
| 0.12081842419990477 | 533.37 |
| 0.12105766819004068 | 533.259 |
| 0.12128799720719965 | 533.28 |
| 0.1215182731851189 | 533.505 |
| 0.12175734981917319 | 533.53 |
| 0.12199636930925203 | 533.658 |
| 0.12223533168266598 | 533.581 |
| 0.12247423696670595 | 533.708 |
| 0.12271308518864335 | 533.836 |
| 0.12295187637573003 | 533.861 |
| 0.12319945146740376 | 533.857 |
| 0.12343812655660347 | 533.779 |
| 0.12368558130899726 | 533.911 |
| 0.12393297484268531 | 534.043 |
| 0.12417147494319108 | 534.068 |
| 0.12442757837505208 | 534.103 |
| 0.12468361623473818 | 534 |
| 0.12493076301470278 | 534.132 |
| 0.12519549537183736 | 534.274 |
| 0.1254425156905144 | 534.406 |
| 0.1257071126227339 | 534.342 |
| 0.12597163956193622 | 534.381 |
| 0.12622728243904646 | 534.38 |
| 0.12650048360934155 | 534.526 |
| 0.1267648007914971 | 534.462 |
| 0.12703785517065172 | 534.403 |
| 0.12731083501146492 | 534.446 |
| 0.12758374035462053 | 534.592 |
| 0.12786537099789588 | 534.605 |
| 0.12814692234768277 | 534.55 |
| 0.12842839444861937 | 534.597 |
| 0.12871857959757285 | 534.512 |
| 0.12900868056353373 | 534.565 |
| 0.12930748447129975 | 534.621 |
| 0.12960619912196017 | 534.575 |
| 0.12990482456882388 | 534.494 |
| 0.13021213999540374 | 534.555 |
| 0.13051936100822623 | 534.513 |
| 0.13082648766528512 | 534.437 |
| 0.13114229099261712 | 534.296 |
| 0.13145799461969218 | 534.121 |
| 0.13178236396524998 | 533.984 |
| 0.1321153905666365 | 534.025 |
| 0.1324395467777234 | 533.888 |
| 0.1327635979456106 | 533.613 |
| 0.13311380544713236 | 533.352 |
| 0.13345513971734366 | 533.327 |
| 0.13379635751822455 | 533.164 |
| 0.1341374589292312 | 532.932 |
| 0.13448718570875198 | 532.567 |
| 0.13484552876925285 | 532.309 |
| 0.13519500804868875 | 531.942 |
| 0.135553097601104 | 531.684 |
| 0.13592851722424407 | 531.123 |
| 0.13628634425796685 | 530.656 |
| 0.13665276606590893 | 530.194 |
| 0.13701905365808775 | 529.731 |
| 0.13738520713279023 | 529.232 |
| 0.13775122658819605 | 528.561 |
| 0.13813453190428107 | 527.863 |
| 0.13850898383730145 | 527.194 |
| 0.1388832956085539 | 526.629 |
| 0.1392574673229277 | 525.821 |
| 0.139631499085194 | 525.011 |
| 0.14000539100000686 | 524.097 |
| 0.140387833421009 | 523.326 |
| 0.14076144270824215 | 522.306 |
| 0.1411522797558837 | 521.399 |
| 0.14152560360128794 | 520.377 |
| 0.14190746518110714 | 519.359 |
| 0.14229785466463485 | 518.101 |
| 0.14267942152151122 | 517.081 |
| 0.14306084284065193 | 515.851 |
| 0.14344211873303725 | 514.481 |
| 0.14382324930951976 | 513.11 |
| 0.1442042346808265 | 511.772 |
| 0.14459372873298323 | 510.507 |
| 0.14497442073180133 | 508.923 |
| 0.14536361497490957 | 507.238 |
| 0.14576130148215222 | 505.66 |
| 0.14614154933919787 | 504.071 |
| 0.14653028969577367 | 502.486 |
| 0.1469102453146207 | 500.441 |
| 0.1473073173452503 | 498.542 |
| 0.14769560487272496 | 496.498 |
| 0.148083741691512 | 494.452 |
| 0.14847172791855728 | 492.299 |
| 0.14886818053473508 | 490.044 |
| 0.14926447603852158 | 487.682 |
| 0.14966061455439347 | 485.177 |
| 0.15005659620667908 | 482.705 |
| 0.15045242111955984 | 479.986 |
| 0.15084808941706893 | 477.16 |
| 0.15125219756878683 | 474.229 |
| 0.15165614248306958 | 471.051 |
| 0.15205992429174203 | 467.764 |
| 0.15246354312646918 | 464.369 |
| 0.15285841664331315 | 460.651 |
| 0.15326171338507913 | 456.547 |
| 0.1536819985847898 | 452.483 |
| 0.15406781925155838 | 448.399 |
| 0.15442778428741363 | 444.195 |
| 0.1547790537875536 | 440.09 |